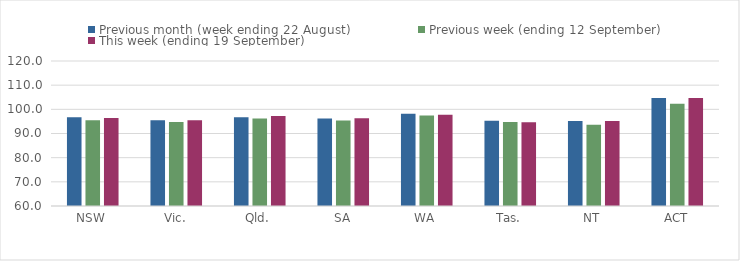
| Category | Previous month (week ending 22 August) | Previous week (ending 12 September) | This week (ending 19 September) |
|---|---|---|---|
| NSW | 96.71 | 95.53 | 96.4 |
| Vic. | 95.48 | 94.73 | 95.51 |
| Qld. | 96.69 | 96.24 | 97.23 |
| SA | 96.23 | 95.36 | 96.3 |
| WA | 98.13 | 97.5 | 97.8 |
| Tas. | 95.26 | 94.77 | 94.64 |
| NT | 95.18 | 93.66 | 95.16 |
| ACT | 104.71 | 102.36 | 104.71 |